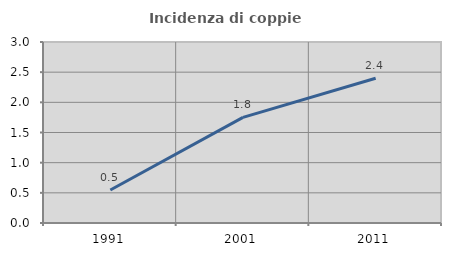
| Category | Incidenza di coppie miste |
|---|---|
| 1991.0 | 0.547 |
| 2001.0 | 1.751 |
| 2011.0 | 2.4 |